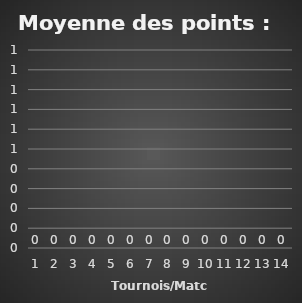
| Category | Moyenne: |
|---|---|
| 0 | 0 |
| 1 | 0 |
| 2 | 0 |
| 3 | 0 |
| 4 | 0 |
| 5 | 0 |
| 6 | 0 |
| 7 | 0 |
| 8 | 0 |
| 9 | 0 |
| 10 | 0 |
| 11 | 0 |
| 12 | 0 |
| 13 | 0 |